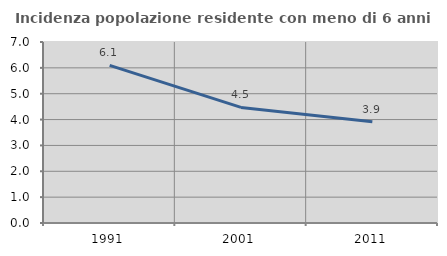
| Category | Incidenza popolazione residente con meno di 6 anni |
|---|---|
| 1991.0 | 6.099 |
| 2001.0 | 4.47 |
| 2011.0 | 3.915 |